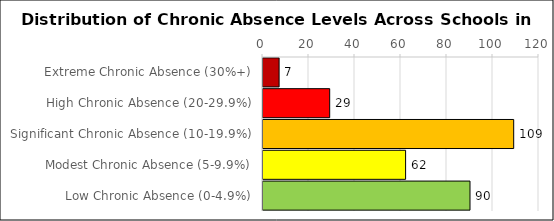
| Category | Number of Schools |
|---|---|
| Extreme Chronic Absence (30%+) | 7 |
| High Chronic Absence (20-29.9%) | 29 |
| Significant Chronic Absence (10-19.9%) | 109 |
| Modest Chronic Absence (5-9.9%) | 62 |
| Low Chronic Absence (0-4.9%) | 90 |